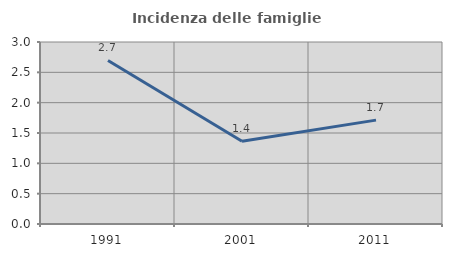
| Category | Incidenza delle famiglie numerose |
|---|---|
| 1991.0 | 2.697 |
| 2001.0 | 1.364 |
| 2011.0 | 1.712 |